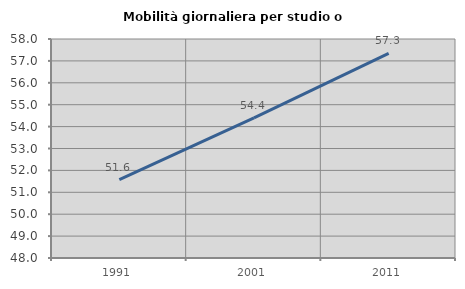
| Category | Mobilità giornaliera per studio o lavoro |
|---|---|
| 1991.0 | 51.574 |
| 2001.0 | 54.397 |
| 2011.0 | 57.34 |